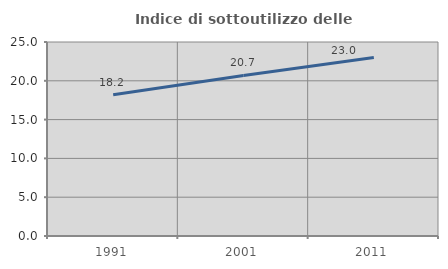
| Category | Indice di sottoutilizzo delle abitazioni  |
|---|---|
| 1991.0 | 18.199 |
| 2001.0 | 20.696 |
| 2011.0 | 23.004 |